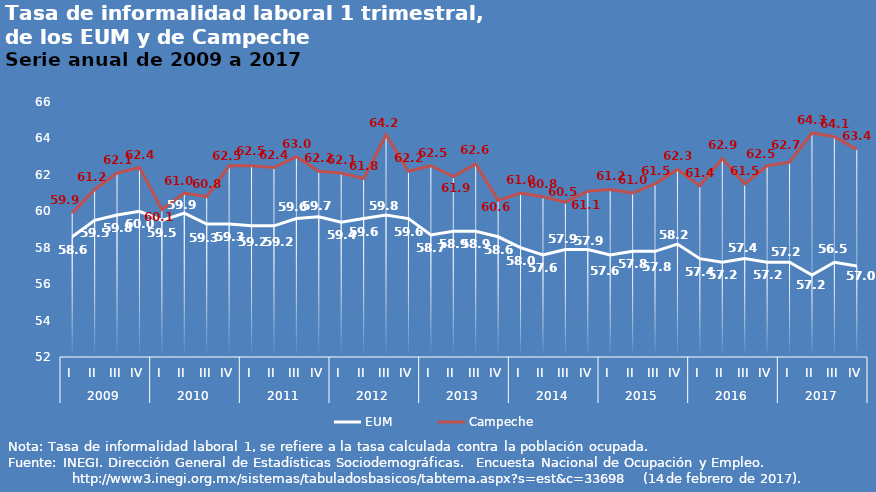
| Category | EUM | Campeche |
|---|---|---|
| 0 | 58.6 | 59.9 |
| 1 | 59.5 | 61.2 |
| 2 | 59.8 | 62.1 |
| 3 | 60 | 62.4 |
| 4 | 59.5 | 60.1 |
| 5 | 59.9 | 61 |
| 6 | 59.3 | 60.8 |
| 7 | 59.3 | 62.5 |
| 8 | 59.2 | 62.5 |
| 9 | 59.2 | 62.4 |
| 10 | 59.6 | 63 |
| 11 | 59.7 | 62.2 |
| 12 | 59.4 | 62.1 |
| 13 | 59.6 | 61.8 |
| 14 | 59.8 | 64.2 |
| 15 | 59.6 | 62.2 |
| 16 | 58.7 | 62.5 |
| 17 | 58.9 | 61.9 |
| 18 | 58.9 | 62.6 |
| 19 | 58.6 | 60.6 |
| 20 | 58 | 61 |
| 21 | 57.6 | 60.8 |
| 22 | 57.9 | 60.5 |
| 23 | 57.9 | 61.1 |
| 24 | 57.6 | 61.2 |
| 25 | 57.8 | 61 |
| 26 | 57.8 | 61.5 |
| 27 | 58.2 | 62.3 |
| 28 | 57.4 | 61.4 |
| 29 | 57.2 | 62.9 |
| 30 | 57.4 | 61.5 |
| 31 | 57.2 | 62.5 |
| 32 | 57.2 | 62.7 |
| 33 | 56.5 | 64.3 |
| 34 | 57.2 | 64.1 |
| 35 | 57 | 63.4 |